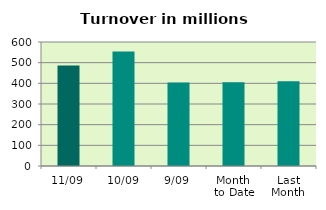
| Category | Series 0 |
|---|---|
| 11/09 | 486.58 |
| 10/09 | 554.612 |
| 9/09 | 404.09 |
| Month 
to Date | 405.809 |
| Last
Month | 410.207 |